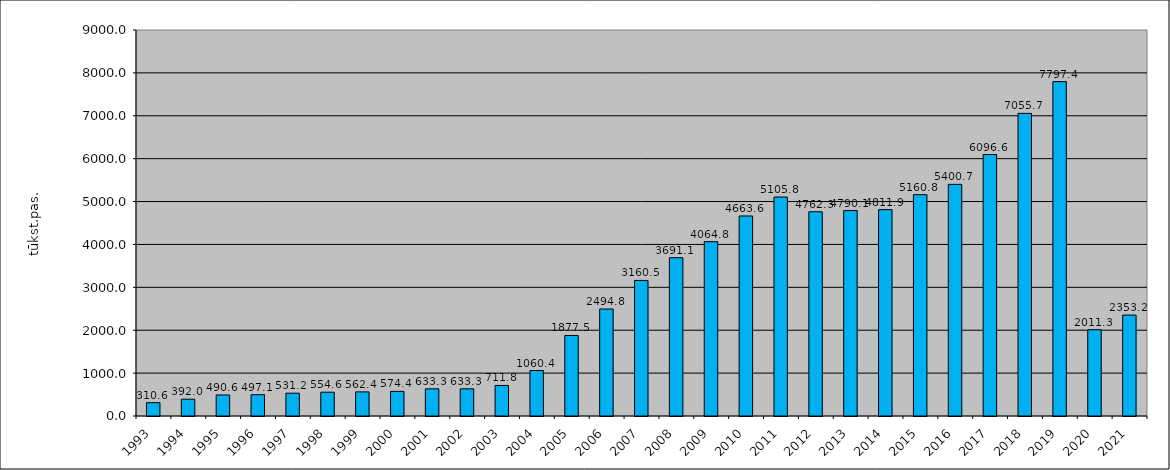
| Category | Series 1 |
|---|---|
| 1993.0 | 310.6 |
| 1994.0 | 392 |
| 1995.0 | 490.62 |
| 1996.0 | 497.13 |
| 1997.0 | 531.22 |
| 1998.0 | 554.62 |
| 1999.0 | 562.383 |
| 2000.0 | 574.356 |
| 2001.0 | 633.319 |
| 2002.0 | 633.319 |
| 2003.0 | 711.848 |
| 2004.0 | 1060.384 |
| 2005.0 | 1877.461 |
| 2006.0 | 2494.835 |
| 2007.0 | 3160.535 |
| 2008.0 | 3691.099 |
| 2009.0 | 4064.755 |
| 2010.0 | 4663.647 |
| 2011.0 | 5105.818 |
| 2012.0 | 4762.335 |
| 2013.0 | 4790.136 |
| 2014.0 | 4811.949 |
| 2015.0 | 5160.759 |
| 2016.0 | 5400.709 |
| 2017.0 | 6096.62 |
| 2018.0 | 7055.734 |
| 2019.0 | 7797.398 |
| 2020.0 | 2011.274 |
| 2021.0 | 2353.246 |